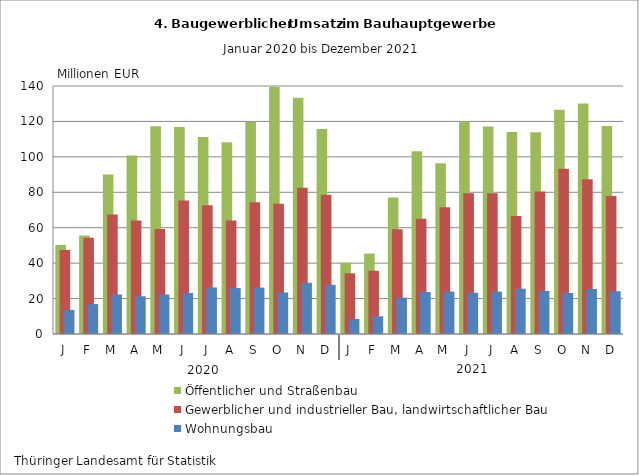
| Category | Öffentlicher und Straßenbau | Gewerblicher und industrieller Bau, landwirtschaftlicher Bau | Wohnungsbau |
|---|---|---|---|
| J | 50.231 | 47.441 | 13.583 |
| F | 55.565 | 54.391 | 16.869 |
| M | 90.097 | 67.394 | 22.313 |
| A | 100.768 | 64.052 | 21.314 |
| M | 117.292 | 59.335 | 22.312 |
| J | 116.853 | 75.353 | 23.216 |
| J | 111.264 | 72.642 | 26.295 |
| A | 108.24 | 64.127 | 25.922 |
| S | 119.88 | 74.433 | 26.207 |
| O | 139.435 | 73.565 | 23.454 |
| N | 133.307 | 82.539 | 28.897 |
| D | 115.668 | 78.63 | 27.752 |
| J | 40.247 | 34.257 | 8.495 |
| F | 45.403 | 35.705 | 10.014 |
| M | 77.037 | 59.127 | 20.555 |
| A | 103.133 | 65.098 | 23.733 |
| M | 96.385 | 71.575 | 23.945 |
| J | 119.977 | 79.482 | 23.268 |
| J | 117.087 | 79.446 | 23.943 |
| A | 114.082 | 66.66 | 25.586 |
| S | 113.88 | 80.378 | 24.312 |
| O | 126.61 | 93.246 | 23.163 |
| N | 130.088 | 87.308 | 25.431 |
| D | 117.426 | 77.97 | 24.166 |